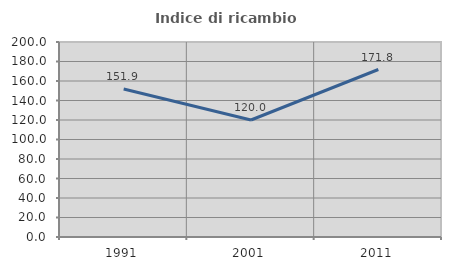
| Category | Indice di ricambio occupazionale  |
|---|---|
| 1991.0 | 151.852 |
| 2001.0 | 120 |
| 2011.0 | 171.782 |